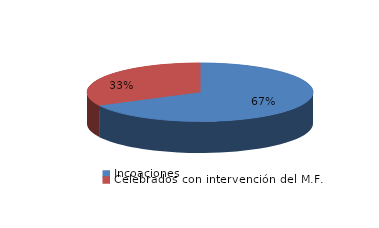
| Category | Series 0 |
|---|---|
| Incoaciones | 3749 |
| Celebrados con intervención del M.F. | 1815 |